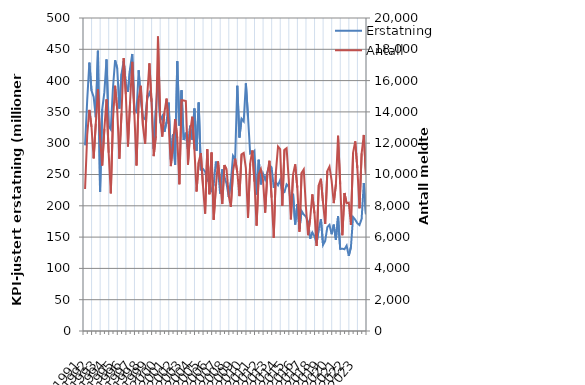
| Category | Erstatning |
|---|---|
| 1991.0 | 296.493 |
| nan | 368.89 |
| nan | 428.732 |
| nan | 383.99 |
| 1992.0 | 373.793 |
| nan | 341.543 |
| nan | 447.591 |
| nan | 221.987 |
| 1993.0 | 354.13 |
| nan | 381.561 |
| nan | 433.804 |
| nan | 327.557 |
| 1994.0 | 321.981 |
| nan | 387.696 |
| nan | 432.444 |
| nan | 419.543 |
| 1995.0 | 355.225 |
| nan | 410.929 |
| nan | 431.533 |
| nan | 395.158 |
| 1996.0 | 382.024 |
| nan | 419.374 |
| nan | 442.474 |
| nan | 353.748 |
| 1997.0 | 349.74 |
| nan | 416.56 |
| nan | 368.709 |
| nan | 340.858 |
| 1998.0 | 338.316 |
| nan | 371.127 |
| nan | 380.56 |
| nan | 370.321 |
| 1999.0 | 290.923 |
| nan | 353.006 |
| nan | 405.699 |
| nan | 336.492 |
| 2000.0 | 343.001 |
| nan | 318.094 |
| nan | 333.666 |
| nan | 364.779 |
| 2001.0 | 274.31 |
| nan | 314.623 |
| nan | 265.684 |
| nan | 430.917 |
| 2002.0 | 328.086 |
| nan | 384.642 |
| nan | 305.034 |
| nan | 316.695 |
| 2003.0 | 289.353 |
| nan | 327.873 |
| nan | 305.727 |
| nan | 355.484 |
| 2004.0 | 287.895 |
| nan | 364.96 |
| nan | 257.852 |
| nan | 258.928 |
| 2005.0 | 254.511 |
| nan | 239.872 |
| nan | 240.868 |
| nan | 221.816 |
| 2006.0 | 234.039 |
| nan | 270.65 |
| nan | 258.131 |
| nan | 219.422 |
| 2007.0 | 258.155 |
| nan | 246.606 |
| nan | 235.193 |
| nan | 214.202 |
| 2008.0 | 237.985 |
| nan | 279.823 |
| nan | 274.231 |
| nan | 391.756 |
| 2009.0 | 309.058 |
| nan | 339.195 |
| nan | 334.949 |
| nan | 395.609 |
| 2010.0 | 342.27 |
| nan | 283.4 |
| nan | 284.563 |
| nan | 287.956 |
| 2011.0 | 217.804 |
| nan | 273.601 |
| nan | 234.274 |
| nan | 251.465 |
| 2012.0 | 241.792 |
| nan | 253.445 |
| nan | 264.873 |
| nan | 261.393 |
| 2013.0 | 228.679 |
| nan | 237.69 |
| nan | 232.805 |
| nan | 241.201 |
| 2014.0 | 220.381 |
| nan | 221.791 |
| nan | 234.149 |
| nan | 230.505 |
| 2015.0 | 203.419 |
| nan | 219.172 |
| nan | 170.129 |
| nan | 202.76 |
| 2016.0 | 163.288 |
| nan | 191.643 |
| nan | 186.005 |
| nan | 182.64 |
| 2017.0 | 174.703 |
| nan | 147.452 |
| nan | 157.46 |
| nan | 151.408 |
| 2018.0 | 140.41 |
| nan | 162.959 |
| nan | 178.788 |
| nan | 137.473 |
| 2019.0 | 143.973 |
| nan | 165.889 |
| nan | 169.59 |
| nan | 154.619 |
| 2020.0 | 169.921 |
| nan | 145.43 |
| nan | 183.14 |
| nan | 130.966 |
| 2021.0 | 131.512 |
| nan | 130.58 |
| nan | 136.369 |
| nan | 120.001 |
| 2022.0 | 133.954 |
| nan | 182.131 |
| nan | 177.819 |
| nan | 172.072 |
| 2023.0 | 169.207 |
| nan | 179.327 |
| nan | 236.388 |
| nan | 186.596 |